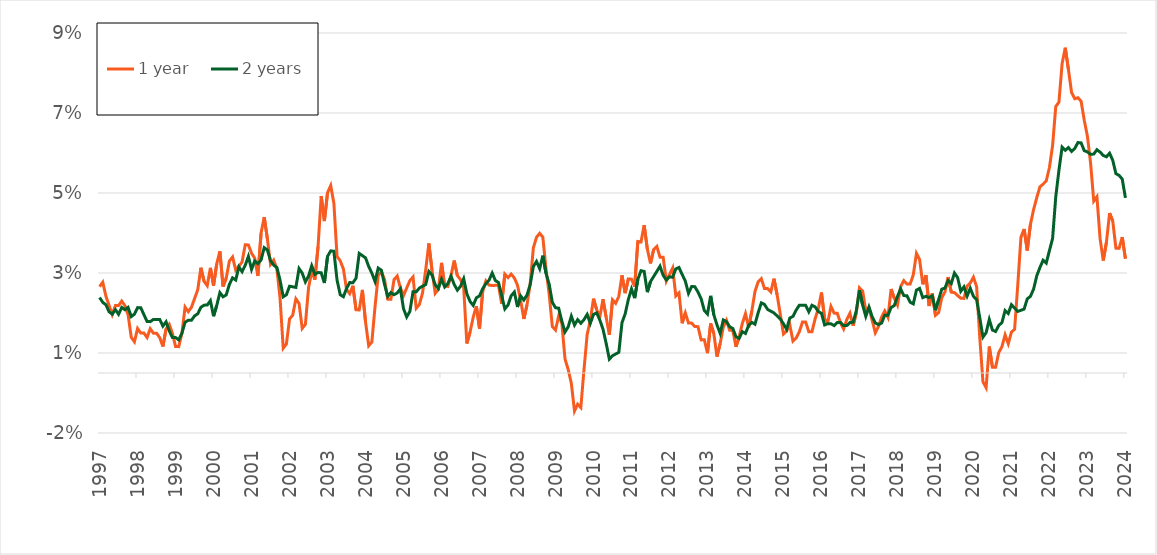
| Category | 1 year | 2 years |
|---|---|---|
| 1997-01-01 | 0.022 | 0.019 |
| 1997-02-01 | 0.023 | 0.018 |
| 1997-03-01 | 0.019 | 0.017 |
| 1997-04-01 | 0.017 | 0.015 |
| 1997-05-01 | 0.015 | 0.015 |
| 1997-06-01 | 0.017 | 0.016 |
| 1997-07-01 | 0.017 | 0.015 |
| 1997-08-01 | 0.018 | 0.016 |
| 1997-09-01 | 0.017 | 0.016 |
| 1997-10-01 | 0.015 | 0.016 |
| 1997-11-01 | 0.009 | 0.014 |
| 1997-12-01 | 0.008 | 0.015 |
| 1998-01-01 | 0.011 | 0.016 |
| 1998-02-01 | 0.01 | 0.016 |
| 1998-03-01 | 0.01 | 0.015 |
| 1998-04-01 | 0.009 | 0.013 |
| 1998-05-01 | 0.011 | 0.013 |
| 1998-06-01 | 0.01 | 0.013 |
| 1998-07-01 | 0.01 | 0.013 |
| 1998-08-01 | 0.009 | 0.013 |
| 1998-09-01 | 0.007 | 0.012 |
| 1998-10-01 | 0.011 | 0.013 |
| 1998-11-01 | 0.012 | 0.011 |
| 1998-12-01 | 0.01 | 0.009 |
| 1999-01-01 | 0.007 | 0.009 |
| 1999-02-01 | 0.007 | 0.008 |
| 1999-03-01 | 0.01 | 0.01 |
| 1999-04-01 | 0.016 | 0.013 |
| 1999-05-01 | 0.015 | 0.013 |
| 1999-06-01 | 0.016 | 0.013 |
| 1999-07-01 | 0.019 | 0.014 |
| 1999-08-01 | 0.021 | 0.015 |
| 1999-09-01 | 0.026 | 0.016 |
| 1999-10-01 | 0.023 | 0.017 |
| 1999-11-01 | 0.022 | 0.017 |
| 1999-12-01 | 0.026 | 0.018 |
| 2000-01-01 | 0.022 | 0.014 |
| 2000-02-01 | 0.027 | 0.017 |
| 2000-03-01 | 0.03 | 0.02 |
| 2000-04-01 | 0.022 | 0.019 |
| 2000-05-01 | 0.024 | 0.02 |
| 2000-06-01 | 0.028 | 0.022 |
| 2000-07-01 | 0.029 | 0.024 |
| 2000-08-01 | 0.026 | 0.023 |
| 2000-09-01 | 0.027 | 0.027 |
| 2000-10-01 | 0.028 | 0.025 |
| 2000-11-01 | 0.032 | 0.027 |
| 2000-12-01 | 0.032 | 0.029 |
| 2001-01-01 | 0.03 | 0.026 |
| 2001-02-01 | 0.029 | 0.028 |
| 2001-03-01 | 0.024 | 0.027 |
| 2001-04-01 | 0.035 | 0.028 |
| 2001-05-01 | 0.039 | 0.031 |
| 2001-06-01 | 0.034 | 0.031 |
| 2001-07-01 | 0.027 | 0.028 |
| 2001-08-01 | 0.028 | 0.027 |
| 2001-09-01 | 0.026 | 0.026 |
| 2001-10-01 | 0.019 | 0.023 |
| 2001-11-01 | 0.006 | 0.019 |
| 2001-12-01 | 0.007 | 0.02 |
| 2002-01-01 | 0.013 | 0.022 |
| 2002-02-01 | 0.014 | 0.022 |
| 2002-03-01 | 0.019 | 0.021 |
| 2002-04-01 | 0.017 | 0.026 |
| 2002-05-01 | 0.011 | 0.025 |
| 2002-06-01 | 0.012 | 0.023 |
| 2002-07-01 | 0.021 | 0.024 |
| 2002-08-01 | 0.025 | 0.027 |
| 2002-09-01 | 0.023 | 0.025 |
| 2002-10-01 | 0.032 | 0.025 |
| 2002-11-01 | 0.044 | 0.025 |
| 2002-12-01 | 0.038 | 0.022 |
| 2003-01-01 | 0.045 | 0.029 |
| 2003-02-01 | 0.047 | 0.031 |
| 2003-03-01 | 0.042 | 0.03 |
| 2003-04-01 | 0.029 | 0.023 |
| 2003-05-01 | 0.028 | 0.02 |
| 2003-06-01 | 0.026 | 0.019 |
| 2003-07-01 | 0.021 | 0.021 |
| 2003-08-01 | 0.02 | 0.023 |
| 2003-09-01 | 0.022 | 0.023 |
| 2003-10-01 | 0.016 | 0.024 |
| 2003-11-01 | 0.016 | 0.03 |
| 2003-12-01 | 0.021 | 0.029 |
| 2004-01-01 | 0.013 | 0.029 |
| 2004-02-01 | 0.007 | 0.027 |
| 2004-03-01 | 0.008 | 0.025 |
| 2004-04-01 | 0.017 | 0.023 |
| 2004-05-01 | 0.024 | 0.026 |
| 2004-06-01 | 0.025 | 0.026 |
| 2004-07-01 | 0.023 | 0.022 |
| 2004-08-01 | 0.018 | 0.019 |
| 2004-09-01 | 0.018 | 0.02 |
| 2004-10-01 | 0.023 | 0.02 |
| 2004-11-01 | 0.024 | 0.02 |
| 2004-12-01 | 0.021 | 0.021 |
| 2005-01-01 | 0.019 | 0.016 |
| 2005-02-01 | 0.021 | 0.014 |
| 2005-03-01 | 0.023 | 0.015 |
| 2005-04-01 | 0.024 | 0.02 |
| 2005-05-01 | 0.016 | 0.02 |
| 2005-06-01 | 0.017 | 0.021 |
| 2005-07-01 | 0.02 | 0.022 |
| 2005-08-01 | 0.026 | 0.022 |
| 2005-09-01 | 0.032 | 0.025 |
| 2005-10-01 | 0.026 | 0.025 |
| 2005-11-01 | 0.02 | 0.022 |
| 2005-12-01 | 0.021 | 0.021 |
| 2006-01-01 | 0.028 | 0.023 |
| 2006-02-01 | 0.022 | 0.022 |
| 2006-03-01 | 0.022 | 0.022 |
| 2006-04-01 | 0.024 | 0.024 |
| 2006-05-01 | 0.028 | 0.022 |
| 2006-06-01 | 0.024 | 0.021 |
| 2006-07-01 | 0.023 | 0.022 |
| 2006-08-01 | 0.021 | 0.024 |
| 2006-09-01 | 0.007 | 0.02 |
| 2006-10-01 | 0.01 | 0.018 |
| 2006-11-01 | 0.014 | 0.017 |
| 2006-12-01 | 0.017 | 0.019 |
| 2007-01-01 | 0.011 | 0.019 |
| 2007-02-01 | 0.02 | 0.021 |
| 2007-03-01 | 0.023 | 0.022 |
| 2007-04-01 | 0.022 | 0.023 |
| 2007-05-01 | 0.022 | 0.025 |
| 2007-06-01 | 0.022 | 0.023 |
| 2007-07-01 | 0.022 | 0.023 |
| 2007-08-01 | 0.017 | 0.019 |
| 2007-09-01 | 0.025 | 0.016 |
| 2007-10-01 | 0.024 | 0.017 |
| 2007-11-01 | 0.025 | 0.019 |
| 2007-12-01 | 0.024 | 0.02 |
| 2008-01-01 | 0.022 | 0.016 |
| 2008-02-01 | 0.018 | 0.019 |
| 2008-03-01 | 0.014 | 0.018 |
| 2008-04-01 | 0.017 | 0.019 |
| 2008-05-01 | 0.022 | 0.022 |
| 2008-06-01 | 0.031 | 0.027 |
| 2008-07-01 | 0.034 | 0.028 |
| 2008-08-01 | 0.035 | 0.026 |
| 2008-09-01 | 0.034 | 0.029 |
| 2008-10-01 | 0.026 | 0.025 |
| 2008-11-01 | 0.02 | 0.022 |
| 2008-12-01 | 0.012 | 0.018 |
| 2009-01-01 | 0.011 | 0.016 |
| 2009-02-01 | 0.014 | 0.016 |
| 2009-03-01 | 0.012 | 0.013 |
| 2009-04-01 | 0.004 | 0.01 |
| 2009-05-01 | 0.001 | 0.012 |
| 2009-06-01 | -0.003 | 0.014 |
| 2009-07-01 | -0.009 | 0.012 |
| 2009-08-01 | -0.008 | 0.013 |
| 2009-09-01 | -0.009 | 0.012 |
| 2009-10-01 | 0.001 | 0.013 |
| 2009-11-01 | 0.01 | 0.015 |
| 2009-12-01 | 0.013 | 0.012 |
| 2010-01-01 | 0.019 | 0.015 |
| 2010-02-01 | 0.016 | 0.015 |
| 2010-03-01 | 0.014 | 0.013 |
| 2010-04-01 | 0.018 | 0.011 |
| 2010-05-01 | 0.014 | 0.007 |
| 2010-06-01 | 0.01 | 0.003 |
| 2010-07-01 | 0.018 | 0.004 |
| 2010-08-01 | 0.017 | 0.005 |
| 2010-09-01 | 0.019 | 0.005 |
| 2010-10-01 | 0.024 | 0.013 |
| 2010-11-01 | 0.02 | 0.015 |
| 2010-12-01 | 0.024 | 0.018 |
| 2011-01-01 | 0.023 | 0.021 |
| 2011-02-01 | 0.022 | 0.019 |
| 2011-03-01 | 0.033 | 0.023 |
| 2011-04-01 | 0.033 | 0.026 |
| 2011-05-01 | 0.037 | 0.025 |
| 2011-06-01 | 0.031 | 0.02 |
| 2011-07-01 | 0.027 | 0.023 |
| 2011-08-01 | 0.031 | 0.024 |
| 2011-09-01 | 0.032 | 0.025 |
| 2011-10-01 | 0.029 | 0.027 |
| 2011-11-01 | 0.029 | 0.024 |
| 2011-12-01 | 0.023 | 0.023 |
| 2012-01-01 | 0.025 | 0.024 |
| 2012-02-01 | 0.026 | 0.024 |
| 2012-03-01 | 0.019 | 0.026 |
| 2012-04-01 | 0.02 | 0.026 |
| 2012-05-01 | 0.012 | 0.025 |
| 2012-06-01 | 0.015 | 0.023 |
| 2012-07-01 | 0.012 | 0.02 |
| 2012-08-01 | 0.012 | 0.022 |
| 2012-09-01 | 0.012 | 0.022 |
| 2012-10-01 | 0.012 | 0.02 |
| 2012-11-01 | 0.008 | 0.019 |
| 2012-12-01 | 0.008 | 0.016 |
| 2013-01-01 | 0.005 | 0.015 |
| 2013-02-01 | 0.012 | 0.019 |
| 2013-03-01 | 0.01 | 0.015 |
| 2013-04-01 | 0.004 | 0.012 |
| 2013-05-01 | 0.007 | 0.01 |
| 2013-06-01 | 0.012 | 0.013 |
| 2013-07-01 | 0.013 | 0.013 |
| 2013-08-01 | 0.011 | 0.012 |
| 2013-09-01 | 0.011 | 0.011 |
| 2013-10-01 | 0.007 | 0.009 |
| 2013-11-01 | 0.009 | 0.009 |
| 2013-12-01 | 0.012 | 0.01 |
| 2014-01-01 | 0.015 | 0.01 |
| 2014-02-01 | 0.011 | 0.012 |
| 2014-03-01 | 0.015 | 0.013 |
| 2014-04-01 | 0.02 | 0.012 |
| 2014-05-01 | 0.023 | 0.015 |
| 2014-06-01 | 0.024 | 0.018 |
| 2014-07-01 | 0.021 | 0.017 |
| 2014-08-01 | 0.021 | 0.016 |
| 2014-09-01 | 0.02 | 0.015 |
| 2014-10-01 | 0.024 | 0.015 |
| 2014-11-01 | 0.02 | 0.014 |
| 2014-12-01 | 0.015 | 0.014 |
| 2015-01-01 | 0.01 | 0.012 |
| 2015-02-01 | 0.01 | 0.011 |
| 2015-03-01 | 0.012 | 0.014 |
| 2015-04-01 | 0.008 | 0.014 |
| 2015-05-01 | 0.009 | 0.016 |
| 2015-06-01 | 0.01 | 0.017 |
| 2015-07-01 | 0.013 | 0.017 |
| 2015-08-01 | 0.013 | 0.017 |
| 2015-09-01 | 0.01 | 0.015 |
| 2015-10-01 | 0.01 | 0.017 |
| 2015-11-01 | 0.014 | 0.017 |
| 2015-12-01 | 0.016 | 0.015 |
| 2016-01-01 | 0.02 | 0.015 |
| 2016-02-01 | 0.014 | 0.012 |
| 2016-03-01 | 0.013 | 0.012 |
| 2016-04-01 | 0.017 | 0.012 |
| 2016-05-01 | 0.015 | 0.012 |
| 2016-06-01 | 0.015 | 0.013 |
| 2016-07-01 | 0.013 | 0.013 |
| 2016-08-01 | 0.011 | 0.012 |
| 2016-09-01 | 0.013 | 0.012 |
| 2016-10-01 | 0.015 | 0.013 |
| 2016-11-01 | 0.012 | 0.013 |
| 2016-12-01 | 0.015 | 0.016 |
| 2017-01-01 | 0.021 | 0.021 |
| 2017-02-01 | 0.02 | 0.017 |
| 2017-03-01 | 0.016 | 0.014 |
| 2017-04-01 | 0.016 | 0.017 |
| 2017-05-01 | 0.013 | 0.014 |
| 2017-06-01 | 0.01 | 0.013 |
| 2017-07-01 | 0.012 | 0.012 |
| 2017-08-01 | 0.014 | 0.012 |
| 2017-09-01 | 0.016 | 0.014 |
| 2017-10-01 | 0.014 | 0.014 |
| 2017-11-01 | 0.021 | 0.016 |
| 2017-12-01 | 0.019 | 0.017 |
| 2018-01-01 | 0.017 | 0.019 |
| 2018-02-01 | 0.022 | 0.021 |
| 2018-03-01 | 0.023 | 0.019 |
| 2018-04-01 | 0.022 | 0.019 |
| 2018-05-01 | 0.022 | 0.018 |
| 2018-06-01 | 0.025 | 0.017 |
| 2018-07-01 | 0.03 | 0.021 |
| 2018-08-01 | 0.028 | 0.021 |
| 2018-09-01 | 0.022 | 0.019 |
| 2018-10-01 | 0.024 | 0.019 |
| 2018-11-01 | 0.017 | 0.019 |
| 2018-12-01 | 0.02 | 0.019 |
| 2019-01-01 | 0.014 | 0.016 |
| 2019-02-01 | 0.015 | 0.018 |
| 2019-03-01 | 0.019 | 0.021 |
| 2019-04-01 | 0.02 | 0.021 |
| 2019-05-01 | 0.024 | 0.023 |
| 2019-06-01 | 0.02 | 0.022 |
| 2019-07-01 | 0.02 | 0.025 |
| 2019-08-01 | 0.019 | 0.024 |
| 2019-09-01 | 0.019 | 0.02 |
| 2019-10-01 | 0.019 | 0.022 |
| 2019-11-01 | 0.022 | 0.019 |
| 2019-12-01 | 0.022 | 0.021 |
| 2020-01-01 | 0.024 | 0.019 |
| 2020-02-01 | 0.022 | 0.018 |
| 2020-03-01 | 0.009 | 0.014 |
| 2020-04-01 | -0.002 | 0.009 |
| 2020-05-01 | -0.004 | 0.01 |
| 2020-06-01 | 0.007 | 0.013 |
| 2020-07-01 | 0.001 | 0.011 |
| 2020-08-01 | 0.001 | 0.01 |
| 2020-09-01 | 0.005 | 0.012 |
| 2020-10-01 | 0.007 | 0.013 |
| 2020-11-01 | 0.01 | 0.016 |
| 2020-12-01 | 0.007 | 0.015 |
| 2021-01-01 | 0.01 | 0.017 |
| 2021-02-01 | 0.011 | 0.016 |
| 2021-03-01 | 0.022 | 0.015 |
| 2021-04-01 | 0.034 | 0.016 |
| 2021-05-01 | 0.036 | 0.016 |
| 2021-06-01 | 0.031 | 0.019 |
| 2021-07-01 | 0.037 | 0.019 |
| 2021-08-01 | 0.041 | 0.021 |
| 2021-09-01 | 0.044 | 0.024 |
| 2021-10-01 | 0.047 | 0.026 |
| 2021-11-01 | 0.047 | 0.028 |
| 2021-12-01 | 0.048 | 0.027 |
| 2022-01-01 | 0.051 | 0.031 |
| 2022-02-01 | 0.057 | 0.034 |
| 2022-03-01 | 0.067 | 0.044 |
| 2022-04-01 | 0.068 | 0.051 |
| 2022-05-01 | 0.077 | 0.056 |
| 2022-06-01 | 0.081 | 0.056 |
| 2022-07-01 | 0.076 | 0.056 |
| 2022-08-01 | 0.07 | 0.055 |
| 2022-09-01 | 0.069 | 0.056 |
| 2022-10-01 | 0.069 | 0.058 |
| 2022-11-01 | 0.068 | 0.058 |
| 2022-12-01 | 0.063 | 0.056 |
| 2023-01-01 | 0.059 | 0.055 |
| 2023-02-01 | 0.052 | 0.055 |
| 2023-03-01 | 0.043 | 0.055 |
| 2023-04-01 | 0.044 | 0.056 |
| 2023-05-01 | 0.034 | 0.055 |
| 2023-06-01 | 0.028 | 0.054 |
| 2023-07-01 | 0.033 | 0.054 |
| 2023-08-01 | 0.04 | 0.055 |
| 2023-09-01 | 0.038 | 0.053 |
| 2023-10-01 | 0.031 | 0.05 |
| 2023-11-01 | 0.031 | 0.049 |
| 2023-12-01 | 0.034 | 0.048 |
| 2024-01-01 | 0.029 | 0.044 |